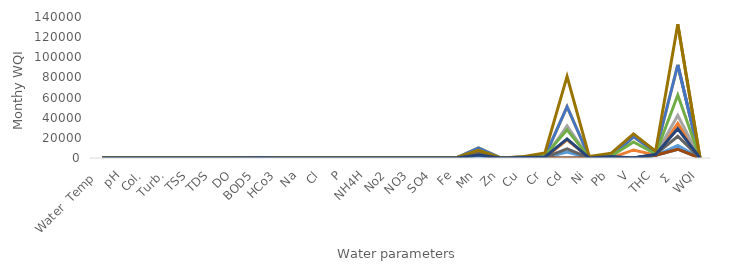
| Category | WiQi |
|---|---|
| Water  Temp  | 2.212 |
| pH | 34.133 |
| Col. | 1.289 |
| Turb. | 7.2 |
| TSS | 4.7 |
| TDS | 0.03 |
| DO | 17.465 |
| BOD5 | 230 |
| HCo3 | 0.092 |
| Na | 0.003 |
| Cl | 0.048 |
| P | 2.44 |
| NH4H | 5.1 |
| No2 | 3.7 |
| NO3 | 1.51 |
| SO4 | 0 |
| Fe | 95 |
| Mn | 2960 |
| Zn | 38 |
| Cu | 530 |
| Cr | 1000 |
| Cd | 19000 |
| Ni | 0 |
| Pb | 1520 |
| V | 0 |
| THC | 3600 |
| Σ  | 29052.921 |
| WQI | 91.945 |